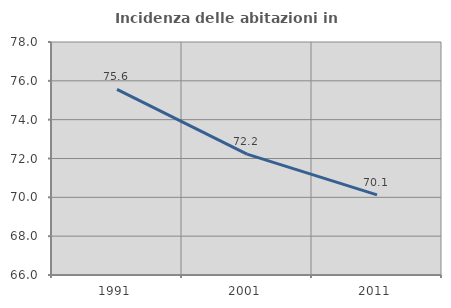
| Category | Incidenza delle abitazioni in proprietà  |
|---|---|
| 1991.0 | 75.556 |
| 2001.0 | 72.222 |
| 2011.0 | 70.127 |